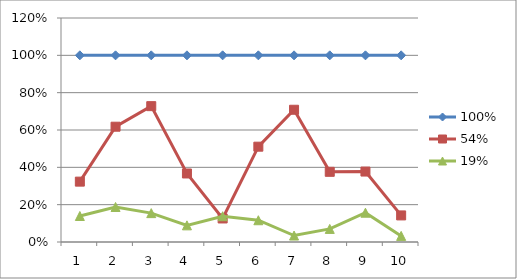
| Category | 100% | 54% | 19% |
|---|---|---|---|
| 1.0 | 1 | 0.323 | 0.139 |
| 2.0 | 1 | 0.618 | 0.188 |
| 3.0 | 1 | 0.728 | 0.155 |
| 4.0 | 1 | 0.367 | 0.089 |
| 5.0 | 1 | 0.126 | 0.138 |
| 6.0 | 1 | 0.511 | 0.117 |
| 7.0 | 1 | 0.708 | 0.035 |
| 8.0 | 1 | 0.376 | 0.07 |
| 9.0 | 1 | 0.377 | 0.157 |
| 10.0 | 1 | 0.142 | 0.033 |